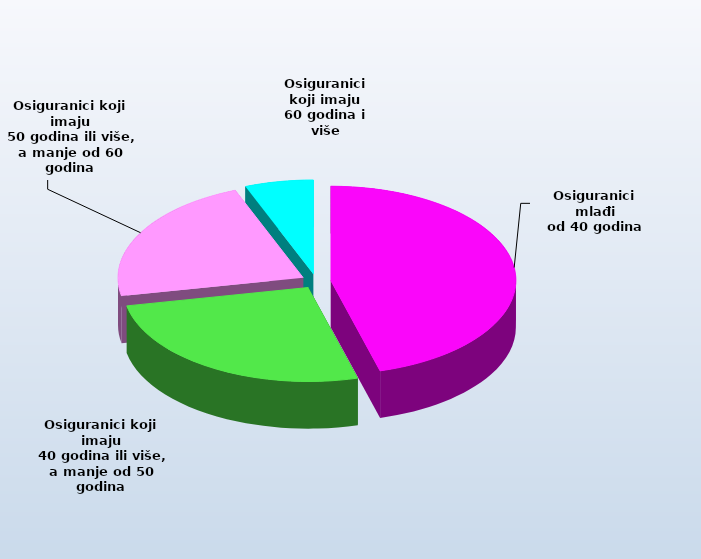
| Category | Series 0 |
|---|---|
| Osiguranici mlađi
od 40 godina | 731406 |
| Osiguranici koji imaju
 40 godina ili više, a manje od 50 godina | 418736 |
| Osiguranici koji imaju
 50 godina ili više, a manje od 60 godina | 354539 |
| Osiguranici koji imaju
60 godina i više | 95724 |